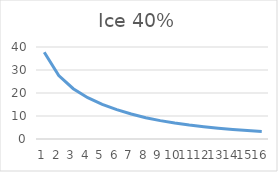
| Category | Series 0 |
|---|---|
| 0 | 37.7 |
| 1 | 27.596 |
| 2 | 21.876 |
| 3 | 17.949 |
| 4 | 15.075 |
| 5 | 12.749 |
| 6 | 10.853 |
| 7 | 9.273 |
| 8 | 7.99 |
| 9 | 6.941 |
| 10 | 6.048 |
| 11 | 5.298 |
| 12 | 4.665 |
| 13 | 4.121 |
| 14 | 3.665 |
| 15 | 3.272 |